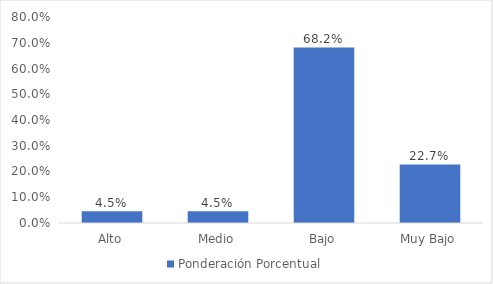
| Category | Ponderación Porcentual |
|---|---|
| Alto | 0.045 |
| Medio | 0.045 |
| Bajo | 0.682 |
| Muy Bajo | 0.227 |